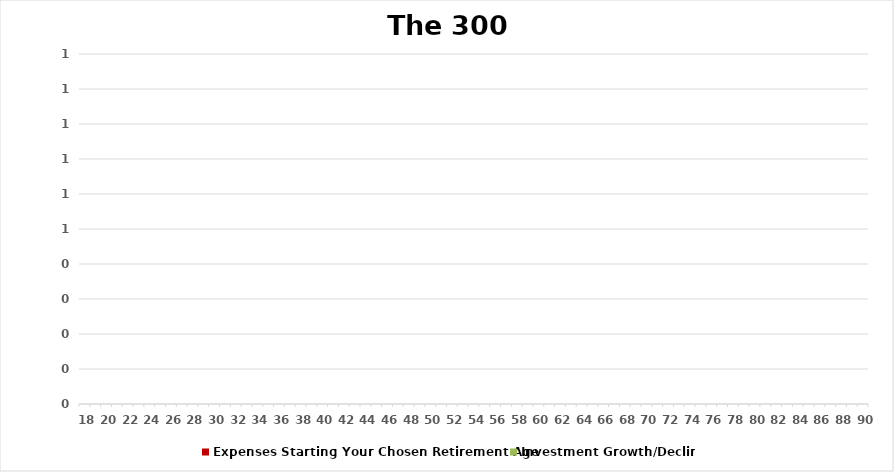
| Category | Investment Growth/Decline |
|---|---|
| 0 | 0 |
| 1 | 0 |
| 2 | 0 |
| 3 | 0 |
| 4 | 0 |
| 5 | 0 |
| 6 | 0 |
| 7 | 0 |
| 8 | 0 |
| 9 | 0 |
| 10 | 0 |
| 11 | 0 |
| 12 | 0 |
| 13 | 0 |
| 14 | 0 |
| 15 | 0 |
| 16 | 0 |
| 17 | 0 |
| 18 | 0 |
| 19 | 0 |
| 20 | 0 |
| 21 | 0 |
| 22 | 0 |
| 23 | 0 |
| 24 | 0 |
| 25 | 0 |
| 26 | 0 |
| 27 | 0 |
| 28 | 0 |
| 29 | 0 |
| 30 | 0 |
| 31 | 0 |
| 32 | 0 |
| 33 | 0 |
| 34 | 0 |
| 35 | 0 |
| 36 | 0 |
| 37 | 0 |
| 38 | 0 |
| 39 | 0 |
| 40 | 0 |
| 41 | 0 |
| 42 | 0 |
| 43 | 0 |
| 44 | 0 |
| 45 | 0 |
| 46 | 0 |
| 47 | 0 |
| 48 | 0 |
| 49 | 0 |
| 50 | 0 |
| 51 | 0 |
| 52 | 0 |
| 53 | 0 |
| 54 | 0 |
| 55 | 0 |
| 56 | 0 |
| 57 | 0 |
| 58 | 0 |
| 59 | 0 |
| 60 | 0 |
| 61 | 0 |
| 62 | 0 |
| 63 | 0 |
| 64 | 0 |
| 65 | 0 |
| 66 | 0 |
| 67 | 0 |
| 68 | 0 |
| 69 | 0 |
| 70 | 0 |
| 71 | 0 |
| 72 | 0 |